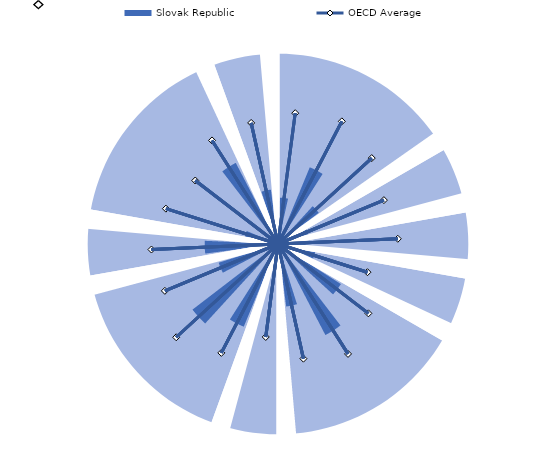
| Category | Outer circle | Slovak Republic |
|---|---|---|
| 0 | 15 | 0 |
| 1 | 15 | 3.658 |
| 2 | 15 | 3.658 |
| 3 | 15 | 3.658 |
| 4 | 15 | 3.658 |
| 5 | 15 | 3.658 |
| 6 | 15 | 0 |
| 7 | 15 | 0 |
| 8 | 15 | 0 |
| 9 | 15 | 6.547 |
| 10 | 15 | 6.547 |
| 11 | 15 | 6.547 |
| 12 | 15 | 6.547 |
| 13 | 15 | 6.547 |
| 14 | 15 | 0 |
| 15 | 15 | 0 |
| 16 | 15 | 0 |
| 17 | 15 | 4.043 |
| 18 | 15 | 4.043 |
| 19 | 15 | 4.043 |
| 20 | 15 | 4.043 |
| 21 | 15 | 4.043 |
| 22 | 15 | 0 |
| 23 | 0 | 0 |
| 24 | 15 | 0 |
| 25 | 15 | 2.517 |
| 26 | 15 | 2.517 |
| 27 | 15 | 2.517 |
| 28 | 15 | 2.517 |
| 29 | 15 | 2.517 |
| 30 | 15 | 0 |
| 31 | 0 | 0 |
| 32 | 15 | 0 |
| 33 | 15 | 2.161 |
| 34 | 15 | 2.161 |
| 35 | 15 | 2.161 |
| 36 | 15 | 2.161 |
| 37 | 15 | 2.161 |
| 38 | 15 | 0 |
| 39 | 0 | 0 |
| 40 | 15 | 0 |
| 41 | 15 | 2.997 |
| 42 | 15 | 2.997 |
| 43 | 15 | 2.997 |
| 44 | 15 | 2.997 |
| 45 | 15 | 2.997 |
| 46 | 15 | 0 |
| 47 | 0 | 0 |
| 48 | 15 | 0 |
| 49 | 15 | 5.879 |
| 50 | 15 | 5.879 |
| 51 | 15 | 5.879 |
| 52 | 15 | 5.879 |
| 53 | 15 | 5.879 |
| 54 | 15 | 0 |
| 55 | 15 | 0 |
| 56 | 15 | 0 |
| 57 | 15 | 8.09 |
| 58 | 15 | 8.09 |
| 59 | 15 | 8.09 |
| 60 | 15 | 8.09 |
| 61 | 15 | 8.09 |
| 62 | 15 | 0 |
| 63 | 15 | 0 |
| 64 | 15 | 0 |
| 65 | 15 | 4.97 |
| 66 | 15 | 4.97 |
| 67 | 15 | 4.97 |
| 68 | 15 | 4.97 |
| 69 | 15 | 4.97 |
| 70 | 15 | 0 |
| 71 | 0 | 0 |
| 72 | 15 | 0 |
| 73 | 15 | 1.43 |
| 74 | 15 | 1.43 |
| 75 | 15 | 1.43 |
| 76 | 15 | 1.43 |
| 77 | 15 | 1.43 |
| 78 | 15 | 0 |
| 79 | 0 | 0 |
| 80 | 15 | 0 |
| 81 | 15 | 7.057 |
| 82 | 15 | 7.057 |
| 83 | 15 | 7.057 |
| 84 | 15 | 7.057 |
| 85 | 15 | 7.057 |
| 86 | 15 | 0 |
| 87 | 15 | 0 |
| 88 | 15 | 0 |
| 89 | 15 | 8.494 |
| 90 | 15 | 8.494 |
| 91 | 15 | 8.494 |
| 92 | 15 | 8.494 |
| 93 | 15 | 8.494 |
| 94 | 15 | 0 |
| 95 | 15 | 0 |
| 96 | 15 | 0 |
| 97 | 15 | 4.901 |
| 98 | 15 | 4.901 |
| 99 | 15 | 4.901 |
| 100 | 15 | 4.901 |
| 101 | 15 | 4.901 |
| 102 | 15 | 0 |
| 103 | 0 | 0 |
| 104 | 15 | 0 |
| 105 | 15 | 5.783 |
| 106 | 15 | 5.783 |
| 107 | 15 | 5.783 |
| 108 | 15 | 5.783 |
| 109 | 15 | 5.783 |
| 110 | 15 | 0 |
| 111 | 0 | 0 |
| 112 | 15 | 0 |
| 113 | 15 | 2.668 |
| 114 | 15 | 2.668 |
| 115 | 15 | 2.668 |
| 116 | 15 | 2.668 |
| 117 | 15 | 2.668 |
| 118 | 15 | 0 |
| 119 | 15 | 0 |
| 120 | 15 | 0 |
| 121 | 15 | 0.487 |
| 122 | 15 | 0.487 |
| 123 | 15 | 0.487 |
| 124 | 15 | 0.487 |
| 125 | 15 | 0.487 |
| 126 | 15 | 0 |
| 127 | 15 | 0 |
| 128 | 15 | 0 |
| 129 | 15 | 7.21 |
| 130 | 15 | 7.21 |
| 131 | 15 | 7.21 |
| 132 | 15 | 7.21 |
| 133 | 15 | 7.21 |
| 134 | 15 | 0 |
| 135 | 0 | 0 |
| 136 | 15 | 0 |
| 137 | 15 | 4.322 |
| 138 | 15 | 4.322 |
| 139 | 15 | 4.322 |
| 140 | 15 | 4.322 |
| 141 | 15 | 4.322 |
| 142 | 15 | 0 |
| 143 | 0 | 0 |